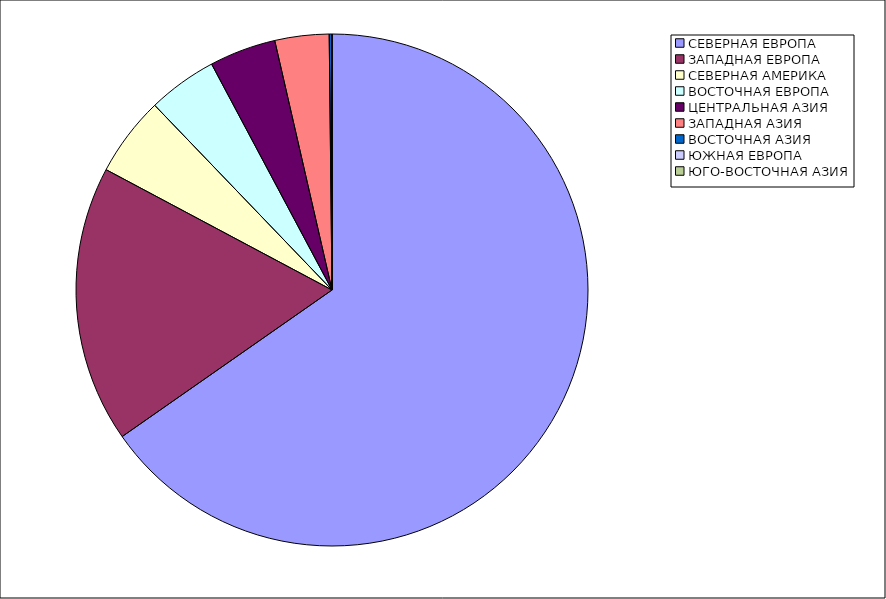
| Category | Оборот |
|---|---|
| СЕВЕРНАЯ ЕВРОПА | 65.295 |
| ЗАПАДНАЯ ЕВРОПА | 17.496 |
| СЕВЕРНАЯ АМЕРИКА | 5.036 |
| ВОСТОЧНАЯ ЕВРОПА | 4.381 |
| ЦЕНТРАЛЬНАЯ АЗИЯ | 4.201 |
| ЗАПАДНАЯ АЗИЯ | 3.417 |
| ВОСТОЧНАЯ АЗИЯ | 0.17 |
| ЮЖНАЯ ЕВРОПА | 0.004 |
| ЮГО-ВОСТОЧНАЯ АЗИЯ | 0 |